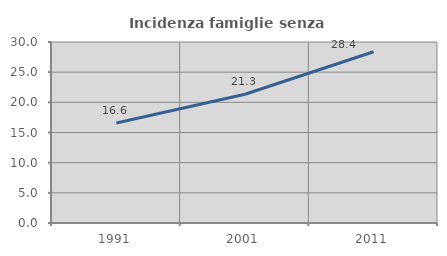
| Category | Incidenza famiglie senza nuclei |
|---|---|
| 1991.0 | 16.565 |
| 2001.0 | 21.345 |
| 2011.0 | 28.382 |